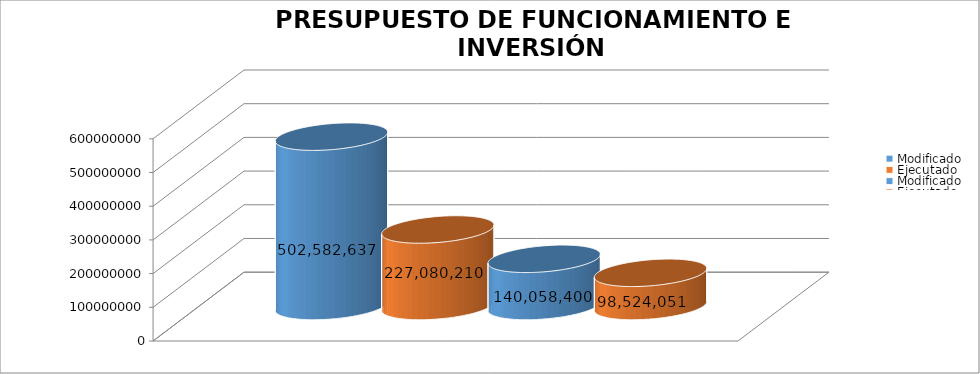
| Category | Modificado | Ejecutado | Series 2 |
|---|---|---|---|
| 0 | 140058400 | 98524050.71 |  |